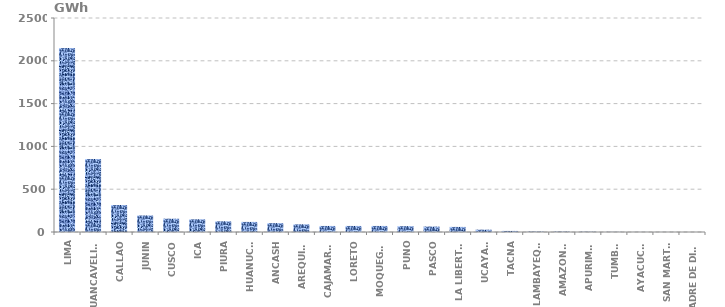
| Category | Series 0 |
|---|---|
| LIMA | 2150.574 |
| HUANCAVELICA | 852.549 |
| CALLAO | 315.585 |
| JUNIN | 193.119 |
| CUSCO | 155.437 |
| ICA | 148.372 |
| PIURA | 124.821 |
| HUANUCO | 117.755 |
| ANCASH | 103.625 |
| AREQUIPA | 89.494 |
| CAJAMARCA | 70.653 |
| LORETO | 70.653 |
| MOQUEGUA | 70.653 |
| PUNO | 68.298 |
| PASCO | 63.588 |
| LA LIBERTAD | 59.349 |
| UCAYALI | 27.319 |
| TACNA | 12.483 |
| LAMBAYEQUE | 4.946 |
| AMAZONAS | 4.71 |
| APURIMAC | 3.297 |
| TUMBES | 1.6 |
| AYACUCHO | 0.72 |
| SAN MARTÍN | 0.471 |
| MADRE DE DIOS | 0.145 |